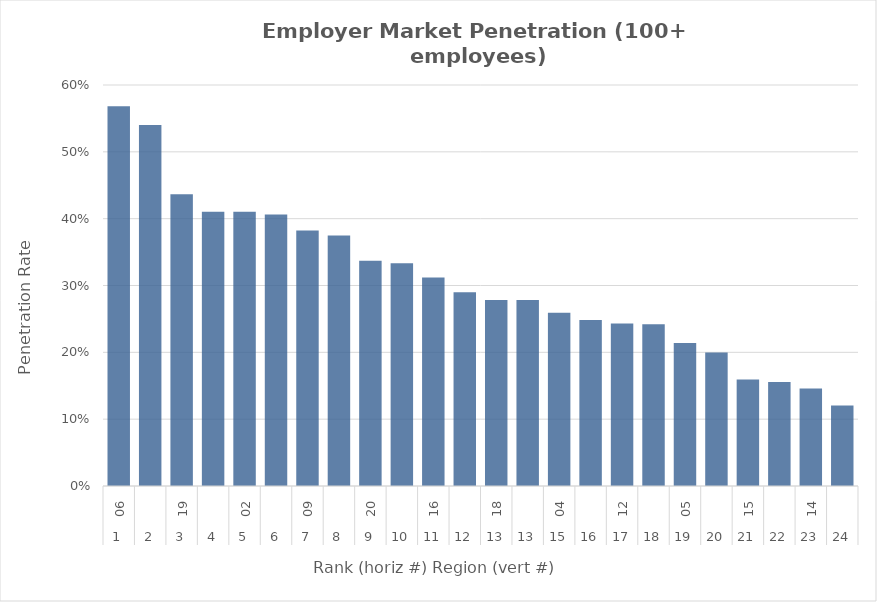
| Category | Rate |
|---|---|
| 0 | 0.568 |
| 1 | 0.54 |
| 2 | 0.437 |
| 3 | 0.41 |
| 4 | 0.41 |
| 5 | 0.406 |
| 6 | 0.382 |
| 7 | 0.375 |
| 8 | 0.337 |
| 9 | 0.333 |
| 10 | 0.312 |
| 11 | 0.29 |
| 12 | 0.278 |
| 13 | 0.278 |
| 14 | 0.259 |
| 15 | 0.249 |
| 16 | 0.243 |
| 17 | 0.242 |
| 18 | 0.214 |
| 19 | 0.2 |
| 20 | 0.159 |
| 21 | 0.156 |
| 22 | 0.146 |
| 23 | 0.12 |